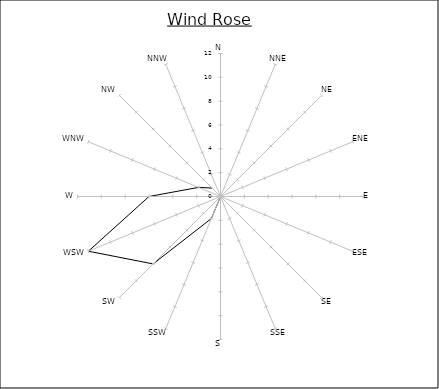
| Category | Series 0 |
|---|---|
| N | 0 |
| NNE | 0 |
| NE | 0 |
| ENE | 0 |
| E | 0 |
| ESE | 0 |
| SE | 0 |
| SSE | 0 |
| S | 0 |
| SSW | 2 |
| SW | 8 |
| WSW | 12 |
| W | 6 |
| WNW | 2 |
| NW | 1 |
| NNW | 0 |